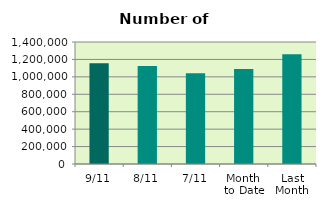
| Category | Series 0 |
|---|---|
| 9/11 | 1155402 |
| 8/11 | 1125850 |
| 7/11 | 1042400 |
| Month 
to Date | 1091151.714 |
| Last
Month | 1260789.391 |